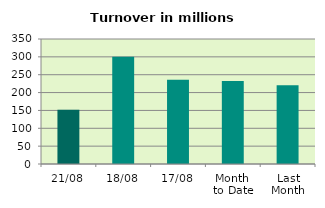
| Category | Series 0 |
|---|---|
| 21/08 | 152.221 |
| 18/08 | 300.18 |
| 17/08 | 235.958 |
| Month 
to Date | 232.548 |
| Last
Month | 220.762 |